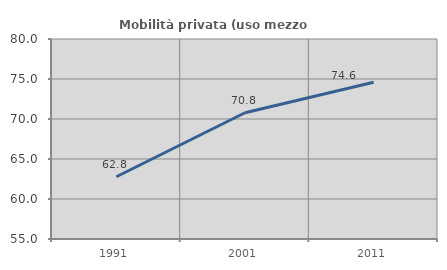
| Category | Mobilità privata (uso mezzo privato) |
|---|---|
| 1991.0 | 62.777 |
| 2001.0 | 70.779 |
| 2011.0 | 74.596 |